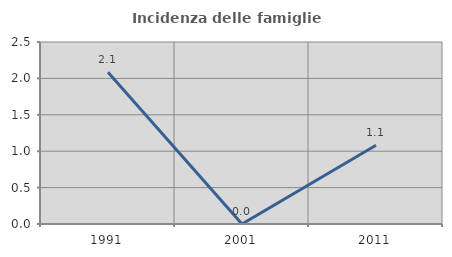
| Category | Incidenza delle famiglie numerose |
|---|---|
| 1991.0 | 2.083 |
| 2001.0 | 0 |
| 2011.0 | 1.081 |